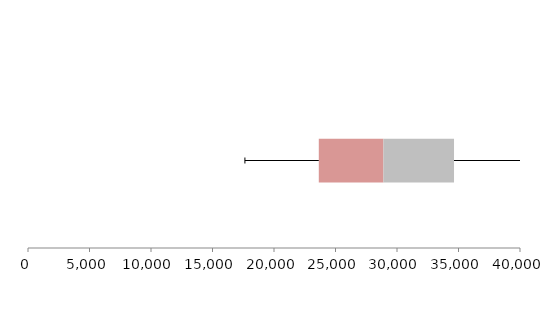
| Category | Series 1 | Series 2 | Series 3 |
|---|---|---|---|
| 0 | 23641.772 | 5253.027 | 5740.129 |